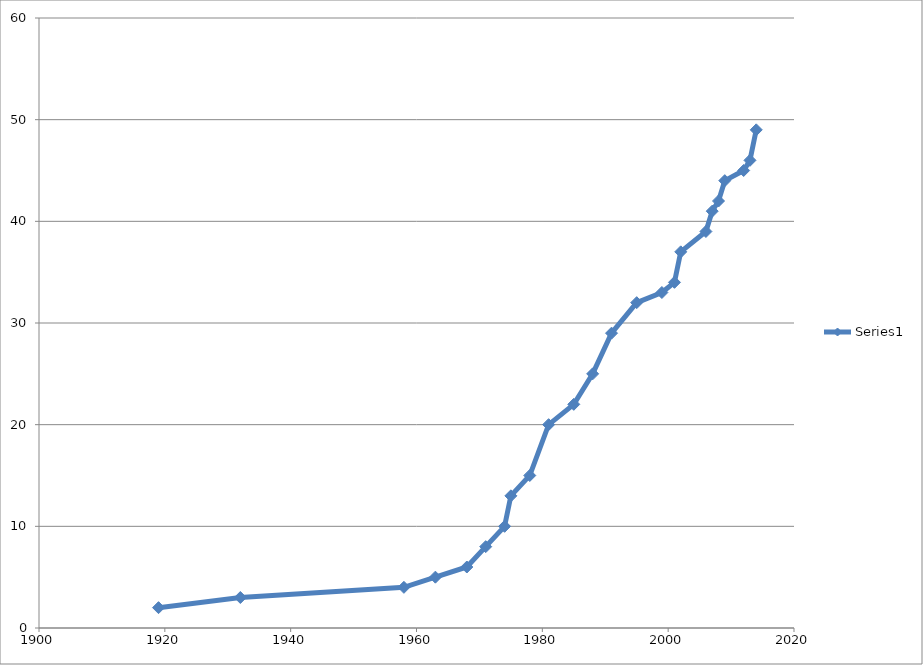
| Category | Series 0 |
|---|---|
| 1919.0 | 2 |
| 1932.0 | 3 |
| 1958.0 | 4 |
| 1963.0 | 5 |
| 1968.0 | 6 |
| 1971.0 | 8 |
| 1974.0 | 10 |
| 1975.0 | 13 |
| 1978.0 | 15 |
| 1981.0 | 20 |
| 1985.0 | 22 |
| 1988.0 | 25 |
| 1991.0 | 29 |
| 1995.0 | 32 |
| 1999.0 | 33 |
| 2001.0 | 34 |
| 2002.0 | 37 |
| 2006.0 | 39 |
| 2007.0 | 41 |
| 2008.0 | 42 |
| 2009.0 | 44 |
| 2012.0 | 45 |
| 2013.0 | 46 |
| 2014.0 | 49 |